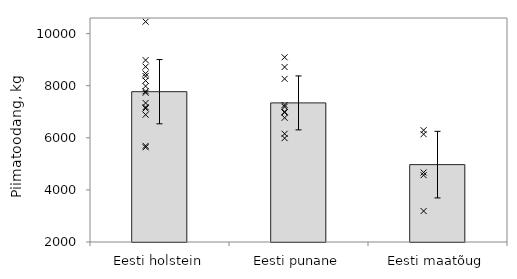
| Category | Keskmised |
|---|---|
| Eesti holstein | 7771.308 |
| Eesti punane | 7340.557 |
| Eesti maatõug | 4970.736 |